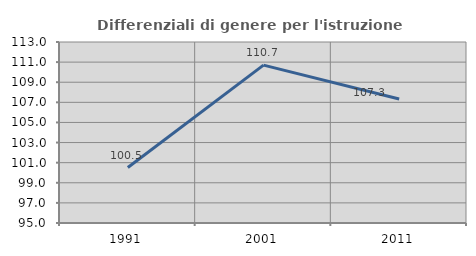
| Category | Differenziali di genere per l'istruzione superiore |
|---|---|
| 1991.0 | 100.519 |
| 2001.0 | 110.703 |
| 2011.0 | 107.327 |